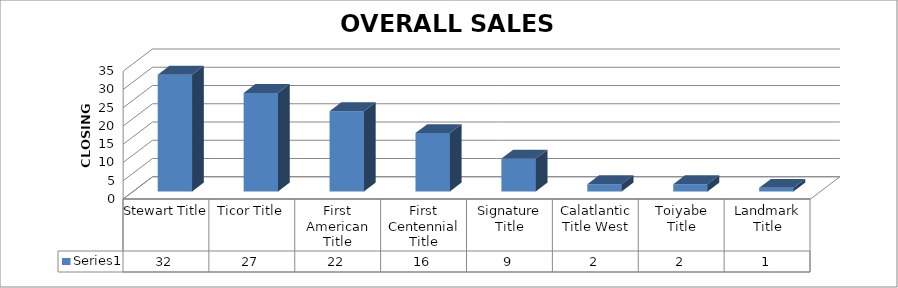
| Category | Series 0 |
|---|---|
| Stewart Title | 32 |
| Ticor Title | 27 |
| First American Title | 22 |
| First Centennial Title | 16 |
| Signature Title | 9 |
| Calatlantic Title West | 2 |
| Toiyabe Title | 2 |
| Landmark Title | 1 |